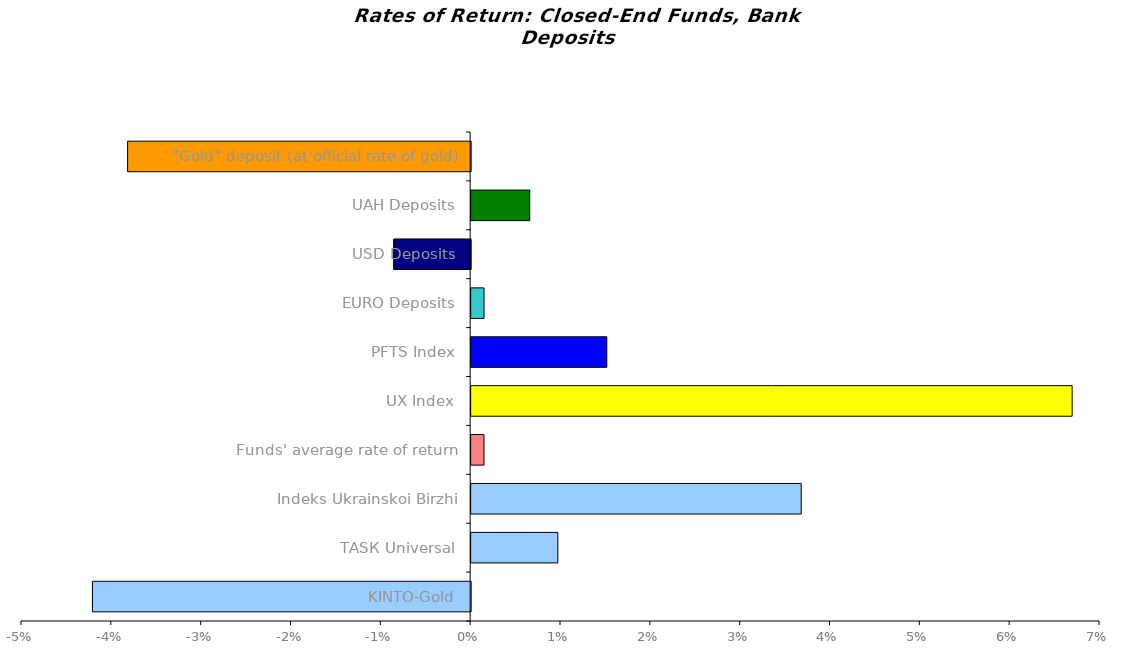
| Category | Series 0 |
|---|---|
| KINTO-Gold | -0.042 |
| ТАSК Universal | 0.01 |
| Іndeks Ukrainskoi Birzhi | 0.037 |
| Funds' average rate of return | 0.001 |
| UX Index | 0.067 |
| PFTS Index | 0.015 |
| EURO Deposits | 0.001 |
| USD Deposits | -0.009 |
| UAH Deposits | 0.007 |
| "Gold" deposit (at official rate of gold) | -0.038 |